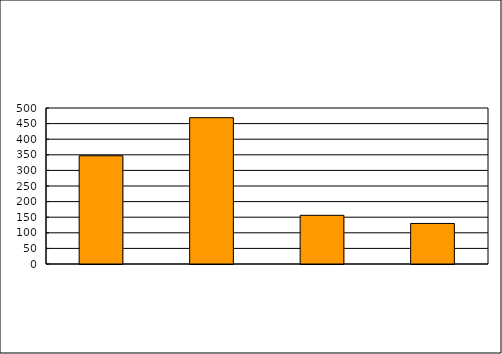
| Category | Series 0 |
|---|---|
| 0 | 347 |
| 1 | 469 |
| 2 | 156 |
| 3 | 130 |